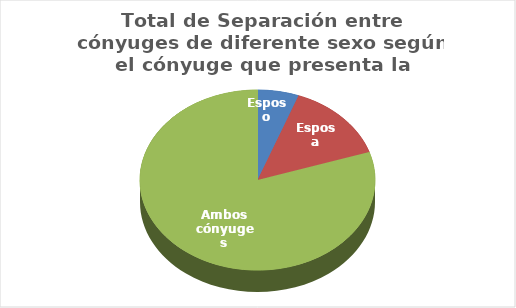
| Category | Series 0 |
|---|---|
| Esposo | 157 |
| Esposa | 396 |
| Ambos cónyuges | 2218 |